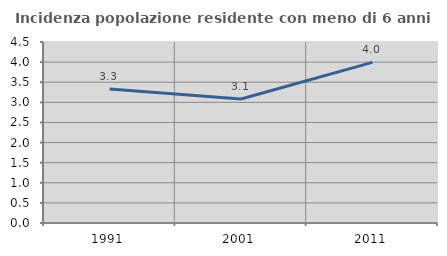
| Category | Incidenza popolazione residente con meno di 6 anni |
|---|---|
| 1991.0 | 3.333 |
| 2001.0 | 3.083 |
| 2011.0 | 3.993 |